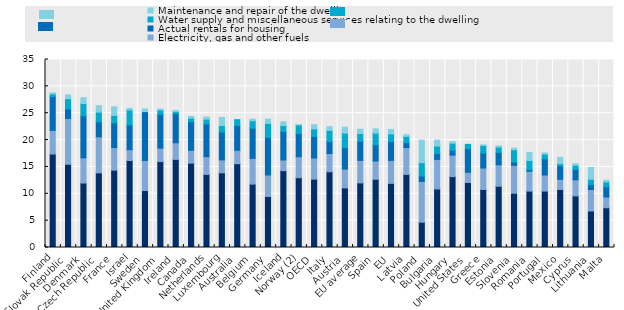
| Category | Imputed rentals for housing | Electricity, gas and other fuels | Actual rentals for housing | Water supply and miscellaneous services relating to the dwelling | Maintenance and repair of the dwelling |
|---|---|---|---|---|---|
| Finland | 17.4 | 4.4 | 6.3 | 0.5 | 0.2 |
| Slovak Republic | 15.5 | 8.5 | 1.8 | 1.9 | 0.7 |
| Denmark | 12 | 4.7 | 7.8 | 2.3 | 1.1 |
| Czech Republic | 13.9 | 6.7 | 2.8 | 1.8 | 1.2 |
| France | 14.4 | 4.2 | 4.6 | 1.4 | 1.6 |
| Israel | 16.2 | 2 | 4.6 | 2.8 | 0.3 |
| Sweden | 10.6 | 5.6 | 9.1 | 0 | 0.5 |
| United Kingdom | 16 | 2.5 | 6.3 | 0.8 | 0.2 |
| Ireland | 16.4 | 3.1 | 5.4 | 0.4 | 0.2 |
| Canada | 15.7 | 2.4 | 5.3 | 0.7 | 0.3 |
| Netherlands | 13.6 | 3.3 | 6.1 | 0.9 | 0.4 |
| Luxembourg | 13.9 | 2.4 | 5.2 | 1.2 | 1.5 |
| Australia | 15.6 | 2.5 | 4.6 | 1.1 | 0 |
| Belgium | 11.8 | 4.8 | 5.6 | 1.4 | 0.3 |
| Germany | 9.5 | 4 | 7 | 2.6 | 0.8 |
| Iceland | 14.3 | 2 | 5.3 | 1.1 | 0.7 |
| Norway (2) | 13 | 3.9 | 4.3 | 1.6 | 0.1 |
| OECD | 12.723 | 3.93 | 4.02 | 1.41 | 0.775 |
| Italy | 14.1 | 3.4 | 2.2 | 2.1 | 0.7 |
| Austria | 11.1 | 3.5 | 4 | 2.7 | 1.1 |
| EU average | 12.025 | 4.196 | 3.575 | 1.418 | 0.821 |
| Spain | 12.7 | 3.4 | 3 | 2.2 | 0.8 |
| EU | 11.941 | 4.278 | 3.511 | 1.43 | 0.826 |
| Latvia | 13.6 | 5 | 0.9 | 1.2 | 0.3 |
| Poland | 4.7 | 7.6 | 1 | 2.5 | 4.2 |
| Bulgaria | 10.9 | 5.5 | 1.1 | 1.4 | 1.1 |
| Hungary | 13.2 | 4 | 0.9 | 1.3 | 0.3 |
| United States | 12.1 | 1.9 | 4.4 | 0.8 | 0 |
| Greece | 10.8 | 4 | 2.8 | 1.4 | 0.1 |
| Estonia | 11.4 | 4 | 2.3 | 1 | 0.2 |
| Slovenia | 10.1 | 5.2 | 0.6 | 2.3 | 0.3 |
| Romania | 10.5 | 3.7 | 0.3 | 1.7 | 1.5 |
| Portugal | 10.5 | 3 | 3 | 0.9 | 0.2 |
| Mexico | 10.8 | 1.9 | 2.5 | 0.4 | 1.2 |
| Cyprus | 9.6 | 3 | 1.9 | 0.8 | 0.3 |
| Lithuania | 6.8 | 4 | 0.9 | 1 | 2.2 |
| Malta | 7.4 | 2 | 1.9 | 0.9 | 0.3 |